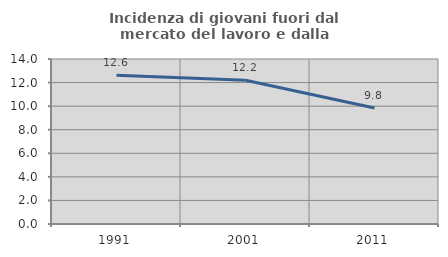
| Category | Incidenza di giovani fuori dal mercato del lavoro e dalla formazione  |
|---|---|
| 1991.0 | 12.632 |
| 2001.0 | 12.195 |
| 2011.0 | 9.836 |